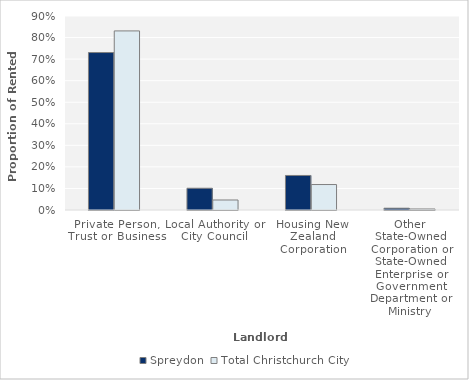
| Category | Spreydon | Total Christchurch City |
|---|---|---|
| Private Person, Trust or Business | 0.73 | 0.831 |
| Local Authority or City Council | 0.101 | 0.046 |
| Housing New Zealand Corporation | 0.16 | 0.118 |
| Other State-Owned Corporation or State-Owned Enterprise or Government Department or Ministry | 0.008 | 0.005 |